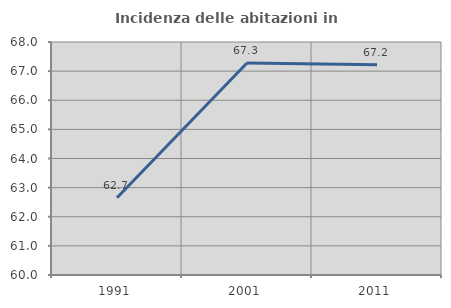
| Category | Incidenza delle abitazioni in proprietà  |
|---|---|
| 1991.0 | 62.654 |
| 2001.0 | 67.282 |
| 2011.0 | 67.217 |